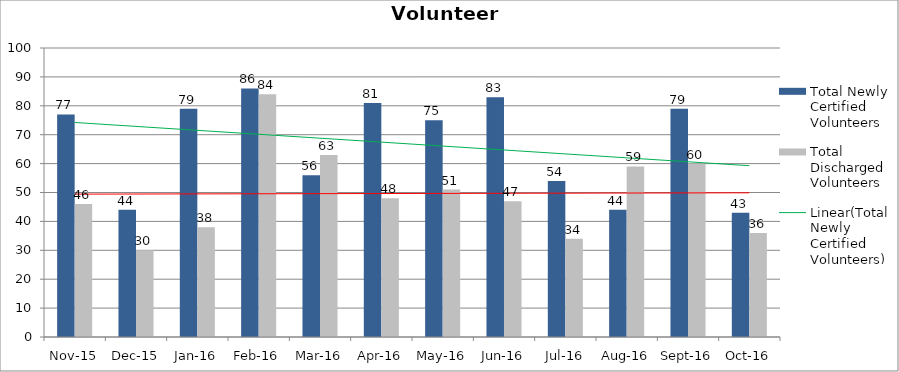
| Category | Total Newly Certified Volunteers | Total Discharged Volunteers |
|---|---|---|
| Nov-15 | 77 | 46 |
| Dec-15 | 44 | 30 |
| Jan-16 | 79 | 38 |
| Feb-16 | 86 | 84 |
| Mar-16 | 56 | 63 |
| Apr-16 | 81 | 48 |
| May-16 | 75 | 51 |
| Jun-16 | 83 | 47 |
| Jul-16 | 54 | 34 |
| Aug-16 | 44 | 59 |
| Sep-16 | 79 | 60 |
| Oct-16 | 43 | 36 |